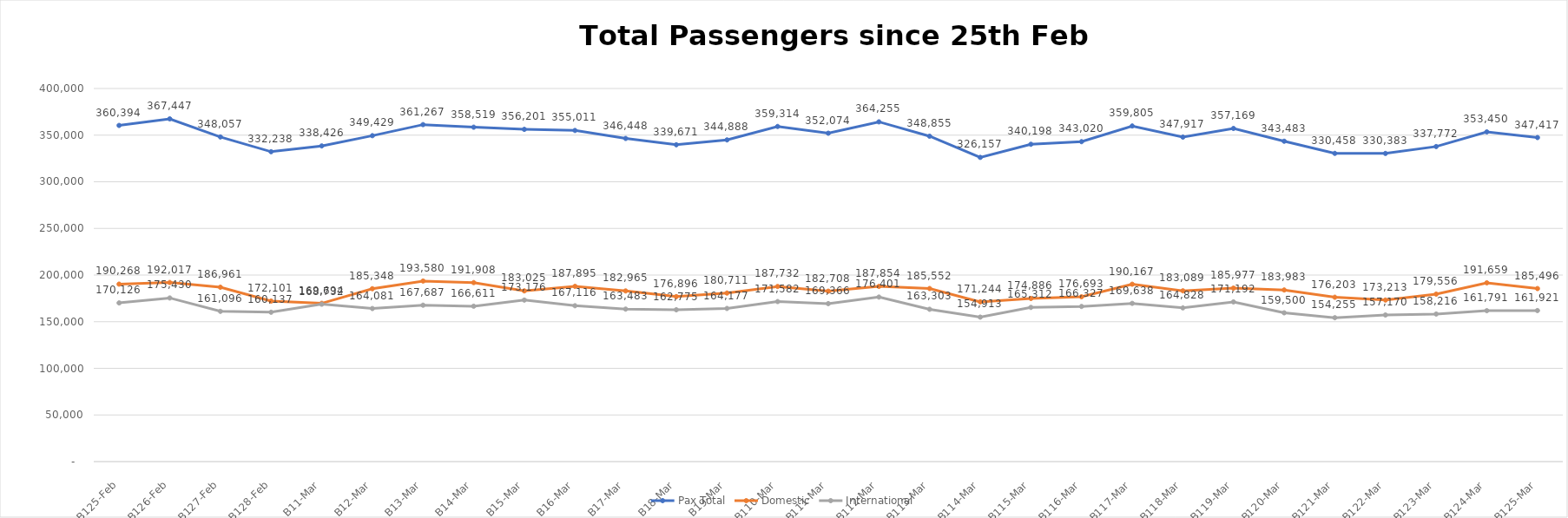
| Category | Pax Total |  Domestic  |  International  |
|---|---|---|---|
| 2023-02-25 | 360394 | 190268 | 170126 |
| 2023-02-26 | 367447 | 192017 | 175430 |
| 2023-02-27 | 348057 | 186961 | 161096 |
| 2023-02-28 | 332238 | 172101 | 160137 |
| 2023-03-01 | 338426 | 169694 | 168732 |
| 2023-03-02 | 349429 | 185348 | 164081 |
| 2023-03-03 | 361267 | 193580 | 167687 |
| 2023-03-04 | 358519 | 191908 | 166611 |
| 2023-03-05 | 356201 | 183025 | 173176 |
| 2023-03-06 | 355011 | 187895 | 167116 |
| 2023-03-07 | 346448 | 182965 | 163483 |
| 2023-03-08 | 339671 | 176896 | 162775 |
| 2023-03-09 | 344888 | 180711 | 164177 |
| 2023-03-10 | 359314 | 187732 | 171582 |
| 2023-03-11 | 352074 | 182708 | 169366 |
| 2023-03-12 | 364255 | 187854 | 176401 |
| 2023-03-13 | 348855 | 185552 | 163303 |
| 2023-03-14 | 326157 | 171244 | 154913 |
| 2023-03-15 | 340198 | 174886 | 165312 |
| 2023-03-16 | 343020 | 176693 | 166327 |
| 2023-03-17 | 359805 | 190167 | 169638 |
| 2023-03-18 | 347917 | 183089 | 164828 |
| 2023-03-19 | 357169 | 185977 | 171192 |
| 2023-03-20 | 343483 | 183983 | 159500 |
| 2023-03-21 | 330458 | 176203 | 154255 |
| 2023-03-22 | 330383 | 173213 | 157170 |
| 2023-03-23 | 337772 | 179556 | 158216 |
| 2023-03-24 | 353450 | 191659 | 161791 |
| 2023-03-25 | 347417 | 185496 | 161921 |